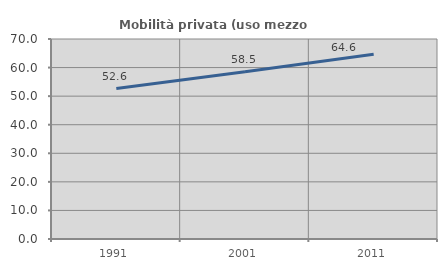
| Category | Mobilità privata (uso mezzo privato) |
|---|---|
| 1991.0 | 52.644 |
| 2001.0 | 58.499 |
| 2011.0 | 64.634 |